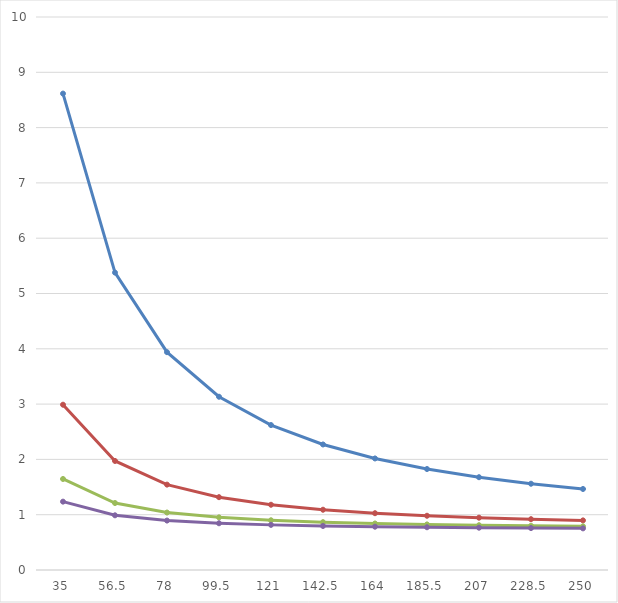
| Category | 0,3 | 0,5 | 0,7 | 0,9 |
|---|---|---|---|---|
| 35.0 | 8.615 | 2.989 | 1.646 | 1.236 |
| 56.5 | 5.378 | 1.972 | 1.211 | 0.989 |
| 78.0 | 3.939 | 1.544 | 1.039 | 0.894 |
| 99.5 | 3.133 | 1.317 | 0.952 | 0.845 |
| 121.0 | 2.621 | 1.18 | 0.899 | 0.816 |
| 142.5 | 2.27 | 1.09 | 0.865 | 0.796 |
| 164.0 | 2.017 | 1.027 | 0.841 | 0.783 |
| 185.5 | 1.826 | 0.981 | 0.824 | 0.773 |
| 207.0 | 1.678 | 0.946 | 0.81 | 0.765 |
| 228.5 | 1.56 | 0.919 | 0.8 | 0.758 |
| 250.0 | 1.465 | 0.897 | 0.79 | 0.753 |